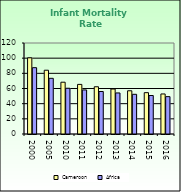
| Category | Cameroon | Africa |
|---|---|---|
| 2000.0 | 100.5 | 87.462 |
| 2005.0 | 84.1 | 73.418 |
| 2010.0 | 68.3 | 60.345 |
| 2011.0 | 65.4 | 58.107 |
| 2012.0 | 62.3 | 56.032 |
| 2013.0 | 59.3 | 54.131 |
| 2014.0 | 57 | 52.336 |
| 2015.0 | 54.5 | 50.754 |
| 2016.0 | 52.8 | 49.283 |